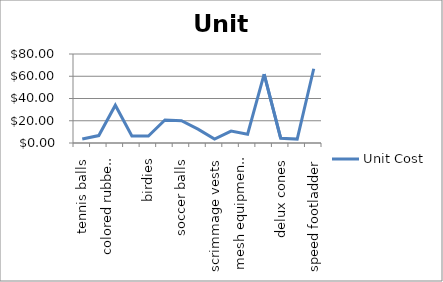
| Category | Unit Cost |
|---|---|
| tennis balls | 3.59 |
| colored rubber footballs | 6.69 |
| colored rubber basketballs | 33.99 |
| badminton racquets | 6.35 |
| birdies | 6.25 |
| volleyballs | 20.75 |
| soccer balls | 19.99 |
| tennis rackets | 12.49 |
| scrimmage vests | 3.49 |
| foal covered safety bats | 10.69 |
| mesh equipment bags | 7.85 |
| PVC Goal | 61.99 |
| delux cones | 4.29 |
| half cones | 3.49 |
| speed footladder | 66.75 |